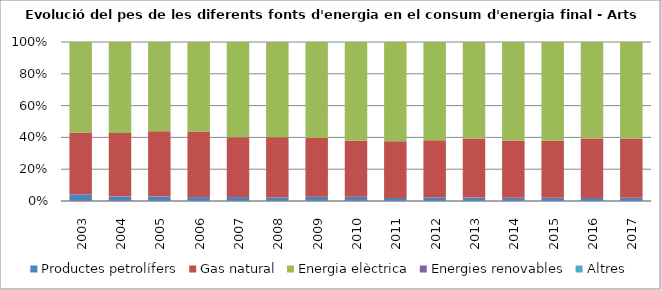
| Category | Productes petrolífers | Gas natural | Energia elèctrica | Energies renovables | Altres |
|---|---|---|---|---|---|
| 2003.0 | 2.2 | 20.4 | 29.9 | 0 | 0 |
| 2004.0 | 1.5 | 20.5 | 29.5 | 0 | 0 |
| 2005.0 | 1.6 | 22.4 | 30.7 | 0 | 0 |
| 2006.0 | 1.4 | 23.5 | 32 | 0 | 0 |
| 2007.0 | 1.3 | 19.7 | 31.4 | 0 | 0 |
| 2008.0 | 1.2 | 19.6 | 31 | 0 | 0 |
| 2009.0 | 1.2 | 16.4 | 26.8 | 0 | 0 |
| 2010.0 | 1.2 | 15.5 | 27.3 | 0 | 0 |
| 2011.0 | 0.8 | 14.8 | 25.9 | 0 | 0 |
| 2012.0 | 0.9 | 13.9 | 23.9 | 0 | 0 |
| 2013.0 | 0.8 | 13.8 | 22.6 | 0 | 0 |
| 2014.0 | 0.7 | 12.7 | 21.8 | 0 | 0 |
| 2015.0 | 0.7 | 12.7 | 21.9 | 0 | 0 |
| 2016.0 | 0.7 | 13.4 | 21.7 | 0 | 0 |
| 2017.0 | 0.7 | 13.2 | 21.5 | 0 | 0 |